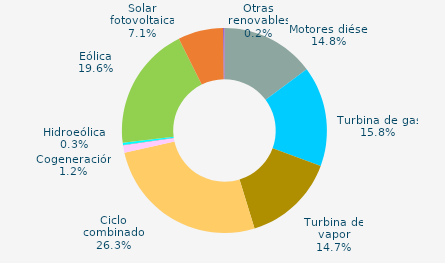
| Category | Series 0 |
|---|---|
| Motores diésel | 14.804 |
| Turbina de gas | 15.809 |
| Turbina de vapor | 14.652 |
| Ciclo combinado | 26.272 |
| Cogeneración | 1.16 |
| Hidráulica | 0.046 |
| Hidroeólica | 0.344 |
| Eólica | 19.572 |
| Solar fotovoltaica | 7.116 |
| Otras renovables | 0.226 |